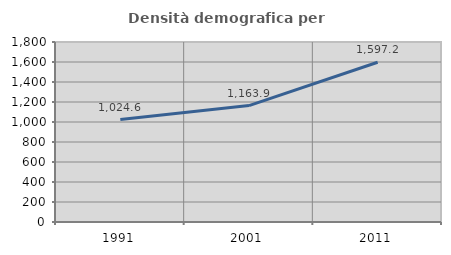
| Category | Densità demografica |
|---|---|
| 1991.0 | 1024.597 |
| 2001.0 | 1163.87 |
| 2011.0 | 1597.166 |